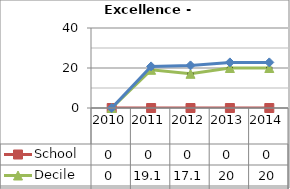
| Category | School  | Decile | National |
|---|---|---|---|
| 2010.0 | 0 | 0 | 0 |
| 2011.0 | 0 | 19.1 | 20.8 |
| 2012.0 | 0 | 17.1 | 21.3 |
| 2013.0 | 0 | 20 | 22.8 |
| 2014.0 | 0 | 20 | 22.8 |